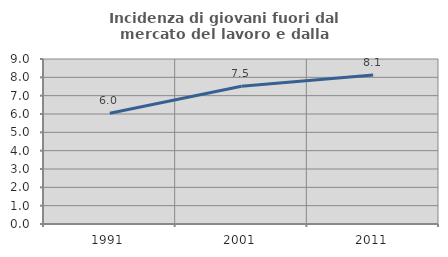
| Category | Incidenza di giovani fuori dal mercato del lavoro e dalla formazione  |
|---|---|
| 1991.0 | 6.042 |
| 2001.0 | 7.515 |
| 2011.0 | 8.127 |